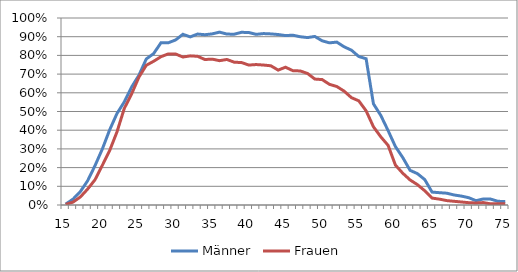
| Category | Männer | Frauen |
|---|---|---|
| 15.0 | 0.005 | 0.003 |
| 16.0 | 0.031 | 0.015 |
| 17.0 | 0.071 | 0.043 |
| 18.0 | 0.13 | 0.085 |
| 19.0 | 0.21 | 0.135 |
| 20.0 | 0.299 | 0.212 |
| 21.0 | 0.401 | 0.291 |
| 22.0 | 0.489 | 0.391 |
| 23.0 | 0.551 | 0.516 |
| 24.0 | 0.631 | 0.594 |
| 25.0 | 0.694 | 0.684 |
| 26.0 | 0.781 | 0.747 |
| 27.0 | 0.809 | 0.768 |
| 28.0 | 0.867 | 0.793 |
| 29.0 | 0.867 | 0.808 |
| 30.0 | 0.882 | 0.808 |
| 31.0 | 0.913 | 0.791 |
| 32.0 | 0.899 | 0.798 |
| 33.0 | 0.914 | 0.795 |
| 34.0 | 0.911 | 0.778 |
| 35.0 | 0.915 | 0.78 |
| 36.0 | 0.924 | 0.772 |
| 37.0 | 0.914 | 0.778 |
| 38.0 | 0.913 | 0.764 |
| 39.0 | 0.924 | 0.762 |
| 40.0 | 0.922 | 0.748 |
| 41.0 | 0.913 | 0.751 |
| 42.0 | 0.917 | 0.748 |
| 43.0 | 0.915 | 0.744 |
| 44.0 | 0.912 | 0.721 |
| 45.0 | 0.906 | 0.737 |
| 46.0 | 0.908 | 0.718 |
| 47.0 | 0.9 | 0.717 |
| 48.0 | 0.895 | 0.704 |
| 49.0 | 0.901 | 0.674 |
| 50.0 | 0.878 | 0.671 |
| 51.0 | 0.867 | 0.645 |
| 52.0 | 0.871 | 0.634 |
| 53.0 | 0.846 | 0.609 |
| 54.0 | 0.828 | 0.574 |
| 55.0 | 0.794 | 0.557 |
| 56.0 | 0.782 | 0.504 |
| 57.0 | 0.541 | 0.418 |
| 58.0 | 0.479 | 0.365 |
| 59.0 | 0.398 | 0.319 |
| 60.0 | 0.312 | 0.213 |
| 61.0 | 0.254 | 0.17 |
| 62.0 | 0.185 | 0.134 |
| 63.0 | 0.168 | 0.109 |
| 64.0 | 0.136 | 0.076 |
| 65.0 | 0.069 | 0.037 |
| 66.0 | 0.066 | 0.031 |
| 67.0 | 0.063 | 0.024 |
| 68.0 | 0.054 | 0.02 |
| 69.0 | 0.048 | 0.016 |
| 70.0 | 0.039 | 0.012 |
| 71.0 | 0.023 | 0.011 |
| 72.0 | 0.032 | 0.013 |
| 73.0 | 0.032 | 0.006 |
| 74.0 | 0.02 | 0.007 |
| 75.0 | 0.019 | 0.007 |